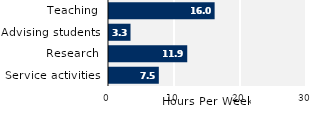
| Category | Series 0 |
|---|---|
| Service activities | 7.55 |
| Research | 11.853 |
| Advising students | 3.26 |
| Teaching | 16.004 |